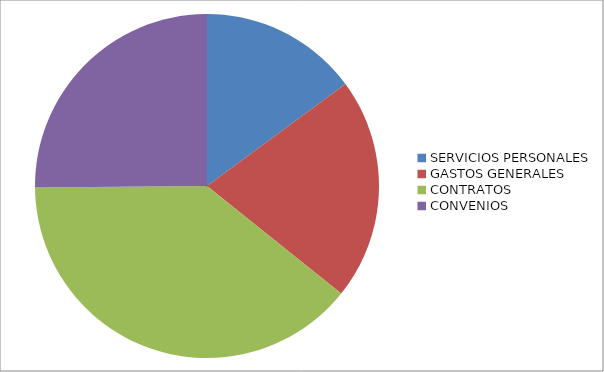
| Category | Series 0 |
|---|---|
| SERVICIOS PERSONALES | 108719342.253 |
| GASTOS GENERALES | 152370000 |
| CONTRATOS | 285557151.64 |
| CONVENIOS | 183598302.36 |